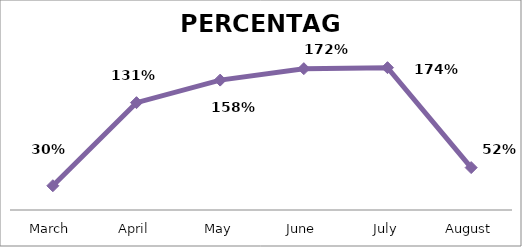
| Category | PERCENTAGE |
|---|---|
| March | 0.296 |
| April | 1.309 |
| May | 1.584 |
| June | 1.724 |
| July | 1.736 |
| August | 0.517 |